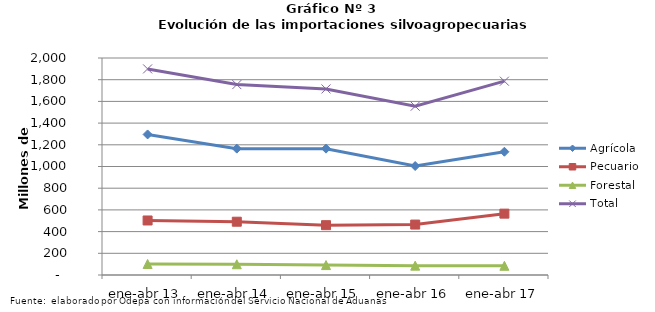
| Category | Agrícola | Pecuario | Forestal | Total |
|---|---|---|---|---|
| ene-abr 13 | 1295446 | 502519 | 101564 | 1899529 |
| ene-abr 14 | 1164693 | 491084 | 99119 | 1754896 |
| ene-abr 15 | 1164472 | 459154 | 91306 | 1714932 |
| ene-abr 16 | 1004458 | 464809 | 86187 | 1555454 |
| ene-abr 17 | 1136037 | 565428 | 84896 | 1786361 |